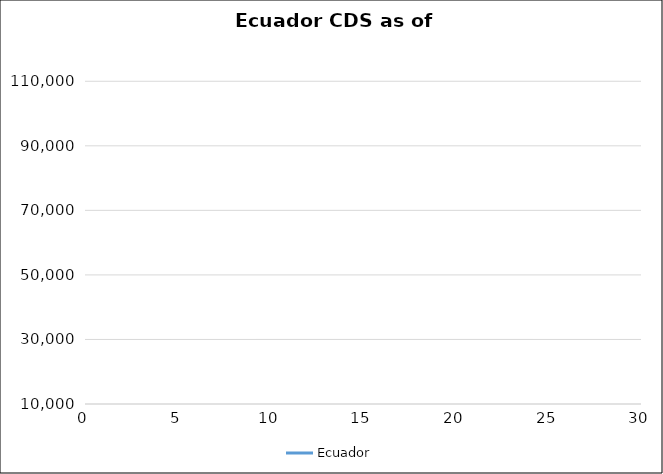
| Category | Ecuador |
|---|---|
| 0.5 | 0 |
| 1.0 | 0 |
| 2.0 | 0 |
| 3.0 | 0 |
| 4.0 | 0 |
| 5.0 | 0 |
| 7.0 | 0 |
| 10.0 | 0 |
| 15.0 | 0 |
| 20.0 | 0 |
| 30.0 | 0 |